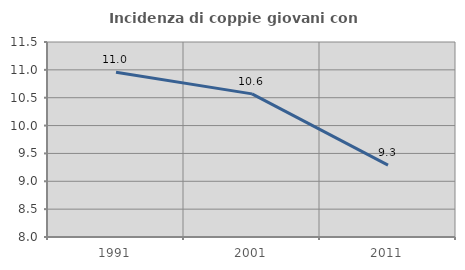
| Category | Incidenza di coppie giovani con figli |
|---|---|
| 1991.0 | 10.959 |
| 2001.0 | 10.569 |
| 2011.0 | 9.29 |